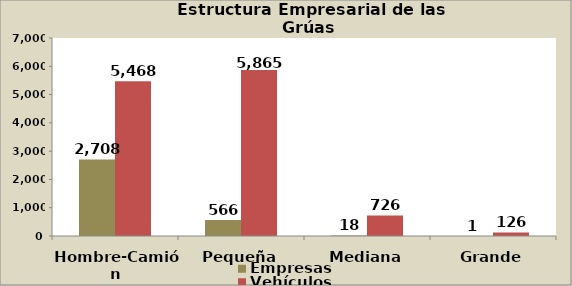
| Category | Empresas | Vehículos |
|---|---|---|
| Hombre-Camión | 2708 | 5468 |
| Pequeña | 566 | 5865 |
| Mediana | 18 | 726 |
| Grande | 1 | 126 |